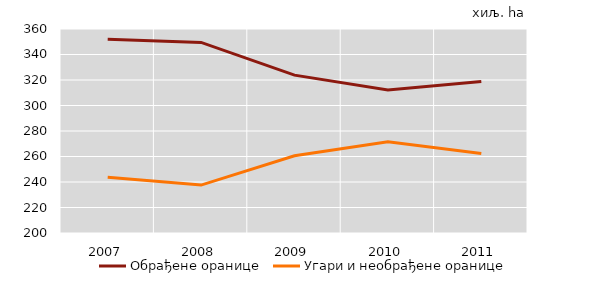
| Category | Обрађене оранице | Угари и необрађене оранице |
|---|---|---|
| 2007.0 | 351.931 | 243.777 |
| 2008.0 | 349.446 | 237.593 |
| 2009.0 | 323.818 | 260.588 |
| 2010.0 | 312.209 | 271.546 |
| 2011.0 | 318.855 | 262.324 |